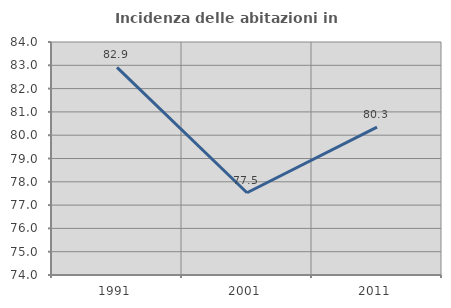
| Category | Incidenza delle abitazioni in proprietà  |
|---|---|
| 1991.0 | 82.91 |
| 2001.0 | 77.531 |
| 2011.0 | 80.347 |